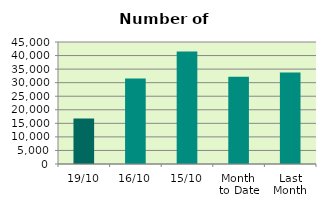
| Category | Series 0 |
|---|---|
| 19/10 | 16746 |
| 16/10 | 31534 |
| 15/10 | 41466 |
| Month 
to Date | 32175.538 |
| Last
Month | 33733.273 |